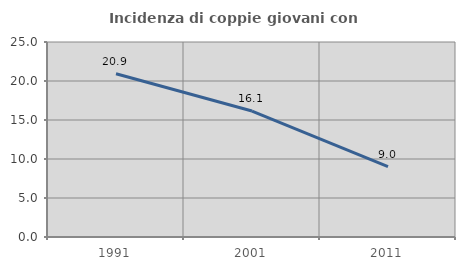
| Category | Incidenza di coppie giovani con figli |
|---|---|
| 1991.0 | 20.935 |
| 2001.0 | 16.149 |
| 2011.0 | 9.024 |